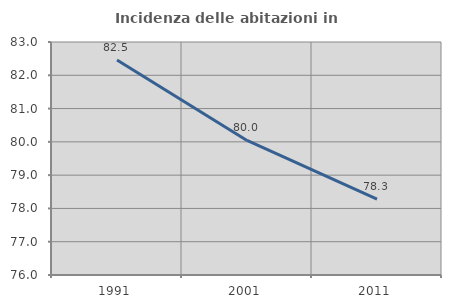
| Category | Incidenza delle abitazioni in proprietà  |
|---|---|
| 1991.0 | 82.459 |
| 2001.0 | 80.042 |
| 2011.0 | 78.276 |